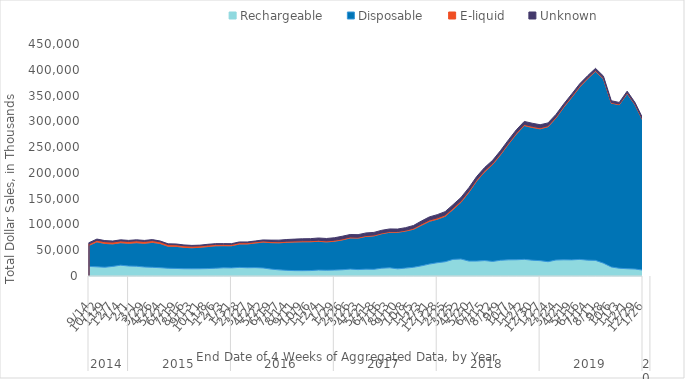
| Category | Rechargeable | Disposable | E-liquid | Unknown |
|---|---|---|---|---|
| 0 | 18640.064 | 40805.871 | 2814.952 | 2404.967 |
| 1 | 17792.268 | 48415.523 | 3170.718 | 2256.571 |
| 2 | 16999.758 | 46178.965 | 3389.334 | 2126.554 |
| 3 | 18616.133 | 43682.492 | 3451.289 | 2100.941 |
| 4 | 20965.984 | 43628.953 | 3532.364 | 2062.144 |
| 5 | 19361.814 | 43989.449 | 3706.266 | 1994.506 |
| 6 | 18927.658 | 45659.066 | 3714.743 | 1913.526 |
| 7 | 17426.885 | 45954.449 | 3719.574 | 1899.092 |
| 8 | 16838.67 | 48469.781 | 3453.765 | 1813.662 |
| 9 | 16068.356 | 46920.543 | 3285.898 | 1588.094 |
| 10 | 15006.082 | 42725.781 | 3173.13 | 1522.447 |
| 11 | 14639.118 | 42893.855 | 3128.437 | 1456.41 |
| 12 | 14104.146 | 41470.191 | 3102.582 | 1601.508 |
| 13 | 14015.782 | 40827.98 | 3076.562 | 1399.01 |
| 14 | 14065.566 | 41518.535 | 2936.937 | 1320.17 |
| 15 | 14401.322 | 42693.262 | 2845.325 | 1539.514 |
| 16 | 15071.196 | 43522.039 | 2787.427 | 1332.448 |
| 17 | 15871.157 | 42895.113 | 2714.599 | 1307.186 |
| 18 | 15704.321 | 42913.457 | 2636.415 | 1460.832 |
| 19 | 16699.094 | 45390.613 | 2558.685 | 1413.857 |
| 20 | 16016.413 | 46078.984 | 2512.483 | 1401.813 |
| 21 | 16227.625 | 47799.934 | 2413.189 | 1453.262 |
| 22 | 15562.271 | 50229.012 | 2285.698 | 1877.057 |
| 23 | 13382.738 | 51337.832 | 2238.508 | 2644.446 |
| 24 | 11926.986 | 52470.023 | 2142.455 | 3038.06 |
| 25 | 10945.535 | 54471.25 | 2079.226 | 3284.711 |
| 26 | 10416.673 | 55465.941 | 2048.998 | 3594.755 |
| 27 | 10328.621 | 56047.074 | 1989.98 | 3806.508 |
| 28 | 10531.018 | 55944.391 | 2066.269 | 3912.703 |
| 29 | 11533.311 | 55786.402 | 2029.986 | 4381.916 |
| 30 | 11235.948 | 54923.797 | 1963.448 | 4620.078 |
| 31 | 11479.683 | 55909.242 | 1994.317 | 4755.525 |
| 32 | 12081.902 | 57875.641 | 1960.027 | 5191.007 |
| 33 | 13364.207 | 60389.281 | 1836.602 | 4860.862 |
| 34 | 12445.672 | 61035.211 | 1731.45 | 5002.814 |
| 35 | 13273.813 | 63521.543 | 1699.739 | 5015.54 |
| 36 | 12960.003 | 64822.168 | 1691.687 | 5091.954 |
| 37 | 15134.252 | 66893.664 | 1600.331 | 5057.195 |
| 38 | 15877.408 | 68925.961 | 1579.374 | 4909.794 |
| 39 | 13884.221 | 70882.336 | 1533.422 | 4762.095 |
| 40 | 15330.66 | 71844.281 | 1649.82 | 4938.755 |
| 41 | 16897.324 | 73756.602 | 2145.514 | 5182.112 |
| 42 | 19644.238 | 78793.617 | 2557.256 | 5588.033 |
| 43 | 23088.562 | 82868.008 | 2634.33 | 5973.804 |
| 44 | 25720.68 | 84403.844 | 2618.225 | 6220.714 |
| 45 | 27638.141 | 88132.172 | 2728.916 | 6363.861 |
| 46 | 32215.504 | 96980.203 | 2745.915 | 6443.617 |
| 47 | 32959.539 | 110035.781 | 2792.321 | 6490.155 |
| 48 | 28898.447 | 133582.891 | 2659.147 | 6182.192 |
| 49 | 28936.623 | 155848 | 2556.756 | 5900.251 |
| 50 | 29942.434 | 172266.516 | 2510.48 | 5859.665 |
| 51 | 28295.875 | 188126.094 | 2410.299 | 5532.15 |
| 52 | 30472.307 | 204947.391 | 2206.656 | 5634.775 |
| 53 | 31331.832 | 224672.5 | 2230.567 | 5759.406 |
| 54 | 31508.746 | 243941.359 | 2311.391 | 5866.935 |
| 55 | 32250.482 | 259492.109 | 2240.724 | 5857.002 |
| 56 | 30643.707 | 257501.266 | 2208.962 | 5983.347 |
| 57 | 29777.125 | 255667.094 | 2103.844 | 5855.917 |
| 58 | 27706.766 | 261916.984 | 1979.253 | 5319.362 |
| 59 | 30954.346 | 275538.594 | 2113.144 | 4746.205 |
| 60 | 31368.434 | 296392.062 | 2063.765 | 4077.757 |
| 61 | 31274.127 | 315529.219 | 2106.216 | 4241.446 |
| 62 | 32170.451 | 334507.125 | 2122.187 | 3898.667 |
| 63 | 30770.287 | 351999.812 | 1829.516 | 3824.238 |
| 64 | 30297.508 | 366866.781 | 1724.403 | 3841.671 |
| 65 | 24929.029 | 357515.875 | 1663.895 | 3617.036 |
| 66 | 17462.256 | 317779.344 | 1368.977 | 3340.938 |
| 67 | 15049.873 | 317201.156 | 1420.637 | 3006.646 |
| 68 | 14110.761 | 339893.969 | 1516 | 3049.187 |
| 69 | 13514.427 | 318533.812 | 1383.801 | 2869.756 |
| 70 | 11339.261 | 289407.438 | 1436.12 | 2758.492 |